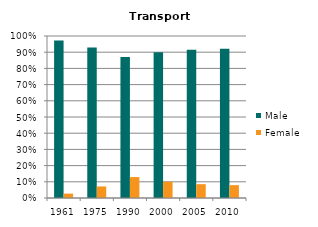
| Category | Male | Female |
|---|---|---|
| 1961.0 | 0.973 | 0.027 |
| 1975.0 | 0.929 | 0.071 |
| 1990.0 | 0.871 | 0.129 |
| 2000.0 | 0.9 | 0.1 |
| 2005.0 | 0.915 | 0.085 |
| 2010.0 | 0.921 | 0.079 |